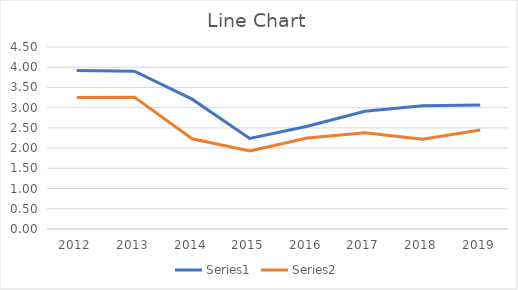
| Category | Series 0 | Series 1 |
|---|---|---|
| 2012.0 | 3.92 | 3.25 |
| 2013.0 | 3.9 | 3.26 |
| 2014.0 | 3.21 | 2.23 |
| 2015.0 | 2.24 | 1.93 |
| 2016.0 | 2.54 | 2.25 |
| 2017.0 | 2.91 | 2.38 |
| 2018.0 | 3.047 | 2.22 |
| 2019.0 | 3.069 | 2.45 |